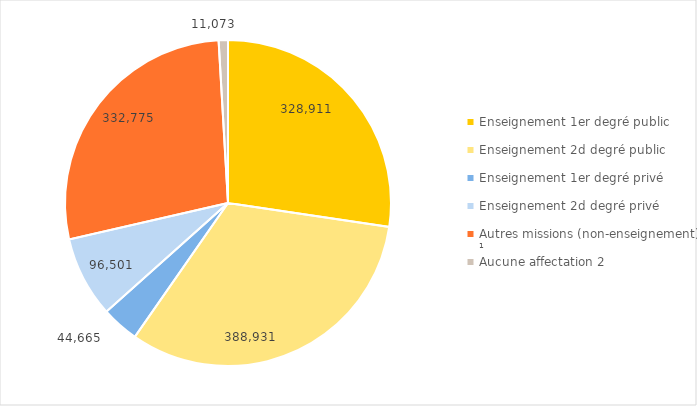
| Category | Series 0 |
|---|---|
| Enseignement 1er degré public  | 328911 |
| Enseignement 2d degré public  | 388931 |
| Enseignement 1er degré privé | 44665 |
| Enseignement 2d degré privé  | 96501 |
| Autres missions (non-enseignement) ¹ | 332775 |
| Aucune affectation 2 | 11073 |